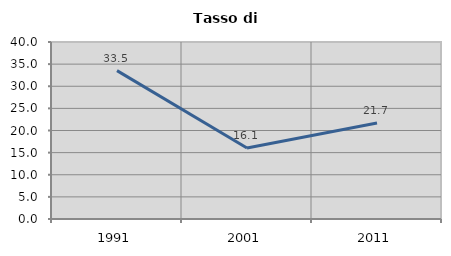
| Category | Tasso di disoccupazione   |
|---|---|
| 1991.0 | 33.532 |
| 2001.0 | 16.051 |
| 2011.0 | 21.678 |